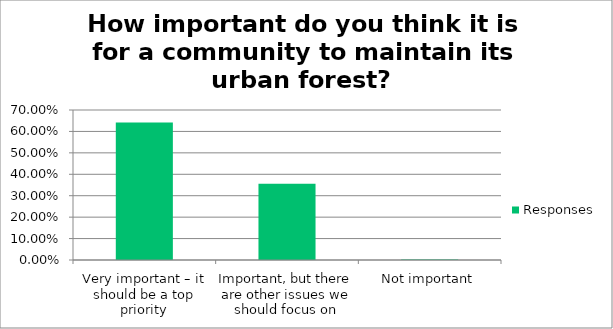
| Category | Responses |
|---|---|
| Very important – it should be a top priority | 0.642 |
| Important, but there are other issues we should focus on | 0.356 |
| Not important | 0.003 |